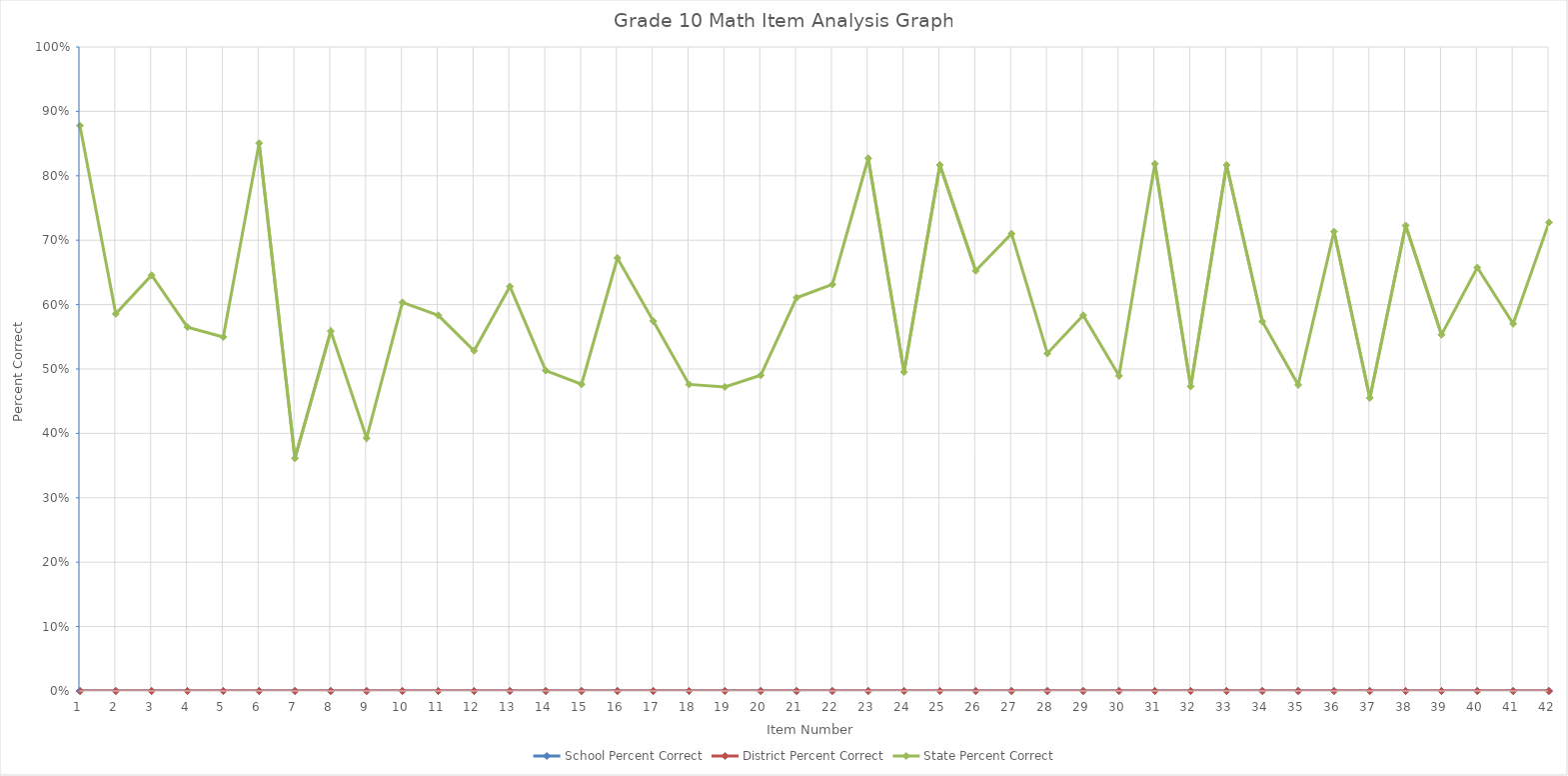
| Category | School Percent Correct | District Percent Correct | State Percent Correct |
|---|---|---|---|
| 0 | 0 | 0 | 0.878 |
| 1 | 0 | 0 | 0.586 |
| 2 | 0 | 0 | 0.646 |
| 3 | 0 | 0 | 0.565 |
| 4 | 0 | 0 | 0.55 |
| 5 | 0 | 0 | 0.851 |
| 6 | 0 | 0 | 0.361 |
| 7 | 0 | 0 | 0.559 |
| 8 | 0 | 0 | 0.393 |
| 9 | 0 | 0 | 0.603 |
| 10 | 0 | 0 | 0.583 |
| 11 | 0 | 0 | 0.528 |
| 12 | 0 | 0 | 0.628 |
| 13 | 0 | 0 | 0.498 |
| 14 | 0 | 0 | 0.476 |
| 15 | 0 | 0 | 0.672 |
| 16 | 0 | 0 | 0.574 |
| 17 | 0 | 0 | 0.476 |
| 18 | 0 | 0 | 0.472 |
| 19 | 0 | 0 | 0.49 |
| 20 | 0 | 0 | 0.611 |
| 21 | 0 | 0 | 0.631 |
| 22 | 0 | 0 | 0.827 |
| 23 | 0 | 0 | 0.495 |
| 24 | 0 | 0 | 0.817 |
| 25 | 0 | 0 | 0.652 |
| 26 | 0 | 0 | 0.71 |
| 27 | 0 | 0 | 0.524 |
| 28 | 0 | 0 | 0.583 |
| 29 | 0 | 0 | 0.489 |
| 30 | 0 | 0 | 0.819 |
| 31 | 0 | 0 | 0.473 |
| 32 | 0 | 0 | 0.817 |
| 33 | 0 | 0 | 0.574 |
| 34 | 0 | 0 | 0.475 |
| 35 | 0 | 0 | 0.713 |
| 36 | 0 | 0 | 0.455 |
| 37 | 0 | 0 | 0.723 |
| 38 | 0 | 0 | 0.553 |
| 39 | 0 | 0 | 0.658 |
| 40 | 0 | 0 | 0.57 |
| 41 | 0 | 0 | 0.728 |